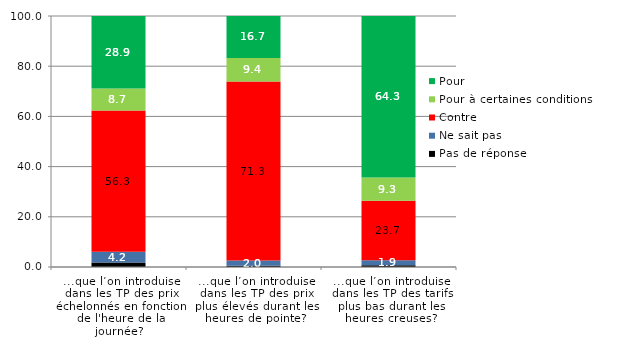
| Category | Pas de réponse | Ne sait pas | Contre | Pour à certaines conditions | Pour |
|---|---|---|---|---|---|
| ...que l’on introduise dans les TP des prix échelonnés en fonction de l'heure de la journée? | 1.806 | 4.245 | 56.3 | 8.731 | 28.918 |
| ...que l’on introduise dans les TP des prix plus élevés durant les heures de pointe? | 0.526 | 2.022 | 71.322 | 9.426 | 16.704 |
| ...que l’on introduise dans les TP des tarifs plus bas durant les heures creuses? | 0.713 | 1.938 | 23.743 | 9.288 | 64.318 |